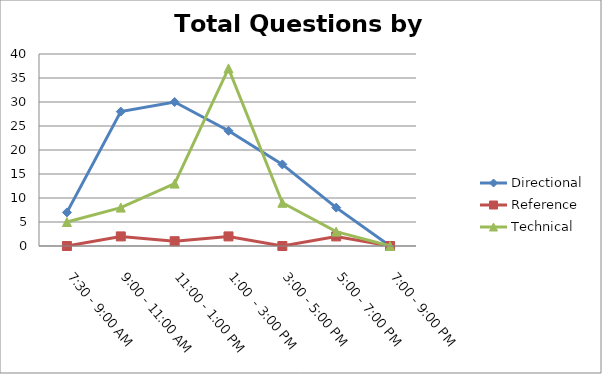
| Category | Directional | Reference | Technical |
|---|---|---|---|
| 7:30 - 9:00 AM | 7 | 0 | 5 |
| 9:00 - 11:00 AM | 28 | 2 | 8 |
| 11:00 - 1:00 PM | 30 | 1 | 13 |
| 1:00  - 3:00 PM | 24 | 2 | 37 |
| 3:00 - 5:00 PM | 17 | 0 | 9 |
| 5:00 - 7:00 PM | 8 | 2 | 3 |
| 7:00 - 9:00 PM | 0 | 0 | 0 |